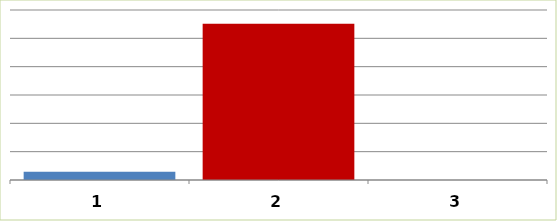
| Category | Series 0 |
|---|---|
| 0 | 2869247 |
| 1 | 55177715 |
| 2 | 0 |